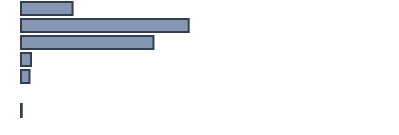
| Category | Series 0 |
|---|---|
| 0 | 13.9 |
| 1 | 45.2 |
| 2 | 35.7 |
| 3 | 2.7 |
| 4 | 2.3 |
| 5 | 0 |
| 6 | 0.2 |